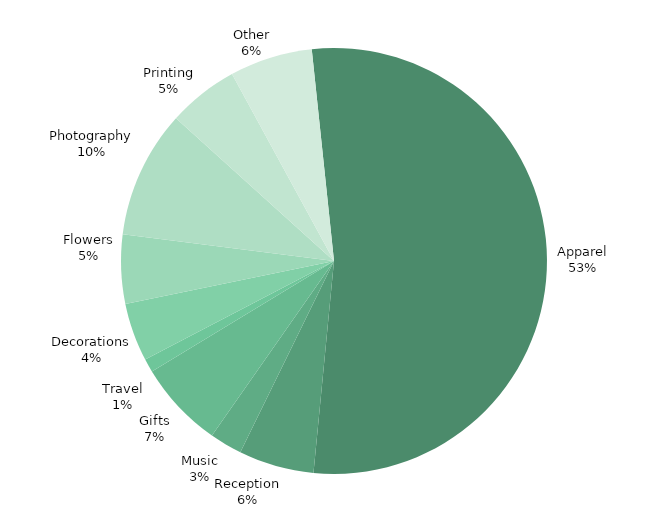
| Category | ACTUAL |
|---|---|
| Apparel | 8645 |
| Reception | 928 |
| Music | 400 |
| Gifts | 1075 |
| Travel | 165 |
| Decorations | 720 |
| Flowers | 850 |
| Photography | 1575 |
| Printing | 870 |
| Other | 1021 |